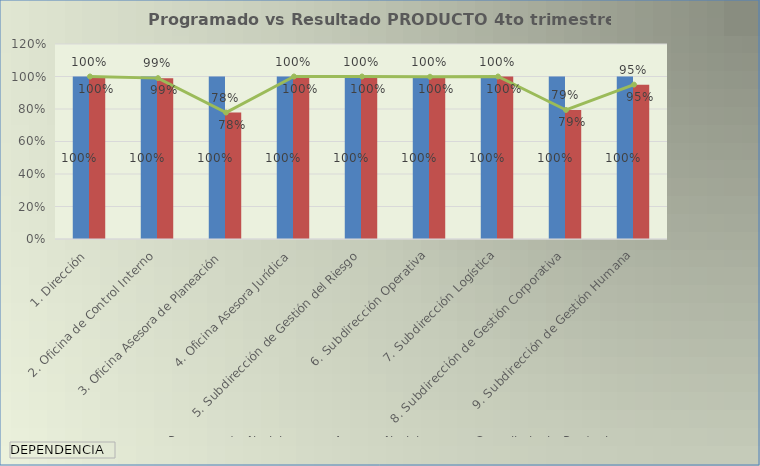
| Category | Programado 4to trim | Avance 4to trim |
|---|---|---|
| 1. Dirección | 1 | 1 |
| 2. Oficina de Control Interno | 1 | 0.99 |
| 3. Oficina Asesora de Planeación | 1 | 0.778 |
| 4. Oficina Asesora Jurídica | 1 | 1 |
| 5. Subdirección de Gestión del Riesgo | 1 | 1 |
| 6. Subdirección Operativa | 1 | 0.998 |
| 7. Subdirección Logística | 1 | 1 |
| 8. Subdirección de Gestión Corporativa | 1 | 0.794 |
| 9. Subdirección de Gestión Humana | 1 | 0.95 |